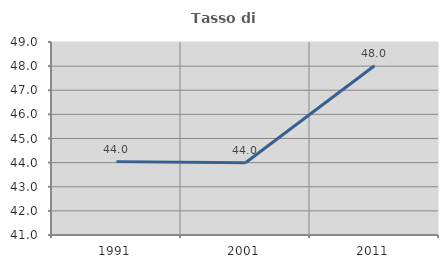
| Category | Tasso di occupazione   |
|---|---|
| 1991.0 | 44.041 |
| 2001.0 | 43.994 |
| 2011.0 | 48.013 |